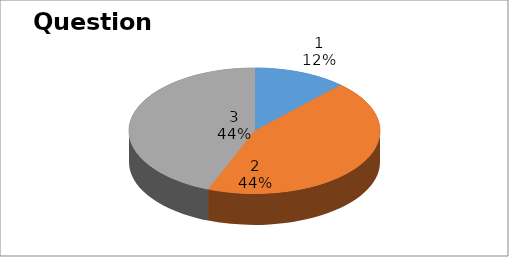
| Category | Series 0 |
|---|---|
| 0 | 3 |
| 1 | 11 |
| 2 | 11 |